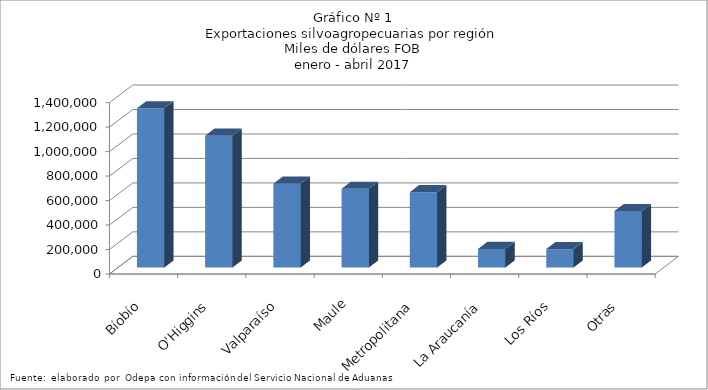
| Category | Series 0 |
|---|---|
| Bíobío | 1301511.581 |
| O'Higgins | 1077352.965 |
| Valparaíso | 685079.205 |
| Maule | 643802.883 |
| Metropolitana | 615676.932 |
| La Araucanía | 152421.371 |
| Los Ríos | 150599.787 |
| Otras | 461479.657 |